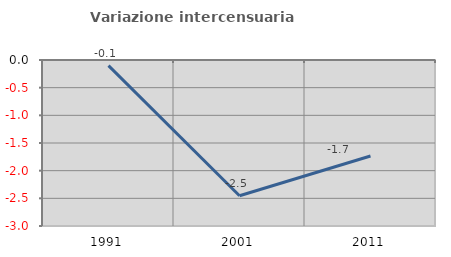
| Category | Variazione intercensuaria annua |
|---|---|
| 1991.0 | -0.102 |
| 2001.0 | -2.454 |
| 2011.0 | -1.735 |